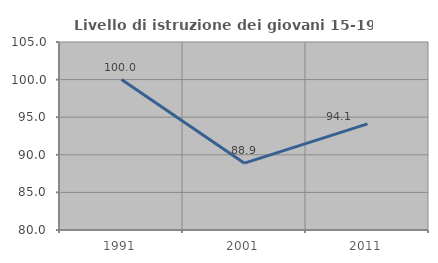
| Category | Livello di istruzione dei giovani 15-19 anni |
|---|---|
| 1991.0 | 100 |
| 2001.0 | 88.889 |
| 2011.0 | 94.118 |